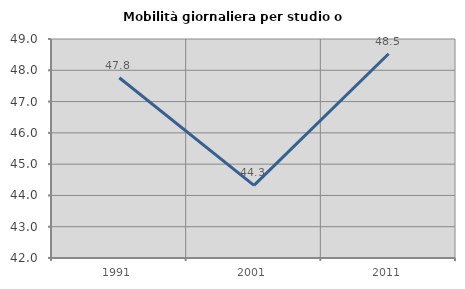
| Category | Mobilità giornaliera per studio o lavoro |
|---|---|
| 1991.0 | 47.761 |
| 2001.0 | 44.321 |
| 2011.0 | 48.527 |